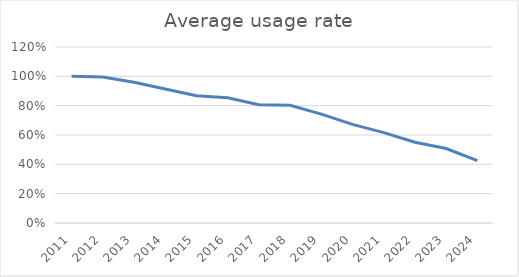
| Category | Average usage rate |
|---|---|
| 2011.0 | 1 |
| 2012.0 | 0.995 |
| 2013.0 | 0.959 |
| 2014.0 | 0.914 |
| 2015.0 | 0.867 |
| 2016.0 | 0.854 |
| 2017.0 | 0.807 |
| 2018.0 | 0.802 |
| 2019.0 | 0.742 |
| 2020.0 | 0.672 |
| 2021.0 | 0.616 |
| 2022.0 | 0.551 |
| 2023.0 | 0.507 |
| 2024.0 | 0.425 |